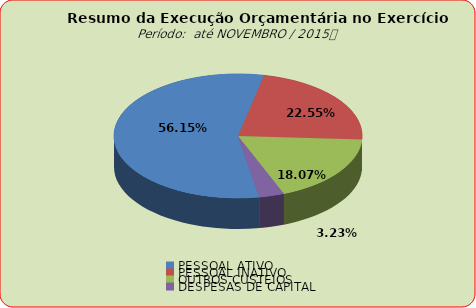
| Category | Series 0 |
|---|---|
| PESSOAL ATIVO | 113177388.21 |
| PESSOAL INATIVO | 45442489.61 |
| OUTROS CUSTEIOS | 36414251.21 |
| DESPESAS DE CAPITAL | 6518312.59 |